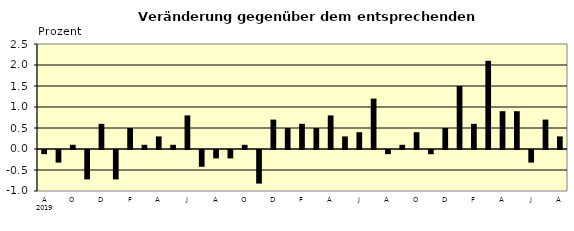
| Category | Series 0 |
|---|---|
| 0 | -0.1 |
| 1 | -0.3 |
| 2 | 0.1 |
| 3 | -0.7 |
| 4 | 0.6 |
| 5 | -0.7 |
| 6 | 0.5 |
| 7 | 0.1 |
| 8 | 0.3 |
| 9 | 0.1 |
| 10 | 0.8 |
| 11 | -0.4 |
| 12 | -0.2 |
| 13 | -0.2 |
| 14 | 0.1 |
| 15 | -0.8 |
| 16 | 0.7 |
| 17 | 0.5 |
| 18 | 0.6 |
| 19 | 0.5 |
| 20 | 0.8 |
| 21 | 0.3 |
| 22 | 0.4 |
| 23 | 1.2 |
| 24 | -0.1 |
| 25 | 0.1 |
| 26 | 0.4 |
| 27 | -0.1 |
| 28 | 0.5 |
| 29 | 1.5 |
| 30 | 0.6 |
| 31 | 2.1 |
| 32 | 0.9 |
| 33 | 0.9 |
| 34 | -0.3 |
| 35 | 0.7 |
| 36 | 0.3 |